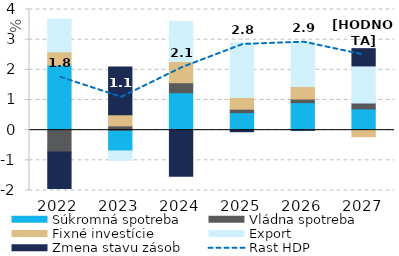
| Category | Súkromná spotreba | Vládna spotreba | Fixné investície | Export | Zmena stavu zásob |
|---|---|---|---|---|---|
| 2022.0 | 2.156 | -0.721 | 0.44 | 1.084 | -1.209 |
| 2023.0 | -0.688 | 0.142 | 0.371 | -0.318 | 1.582 |
| 2024.0 | 1.241 | 0.332 | 0.701 | 1.328 | -1.524 |
| 2025.0 | 0.582 | 0.114 | 0.39 | 1.809 | -0.052 |
| 2026.0 | 0.914 | 0.118 | 0.413 | 1.474 | -0.003 |
| 2027.0 | 0.703 | 0.194 | -0.215 | 1.232 | 0.573 |